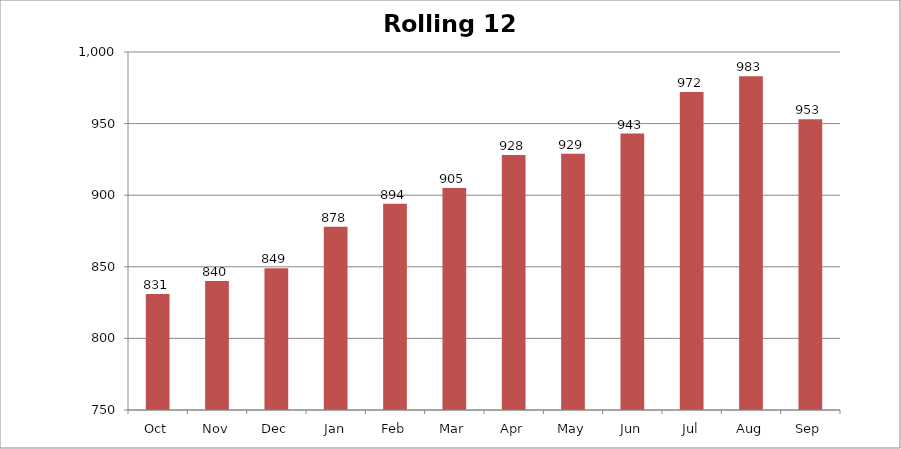
| Category | Rolling 12 Month |
|---|---|
| Oct | 831 |
| Nov | 840 |
| Dec | 849 |
| Jan | 878 |
| Feb | 894 |
| Mar | 905 |
| Apr | 928 |
| May | 929 |
| Jun | 943 |
| Jul | 972 |
| Aug | 983 |
| Sep | 953 |